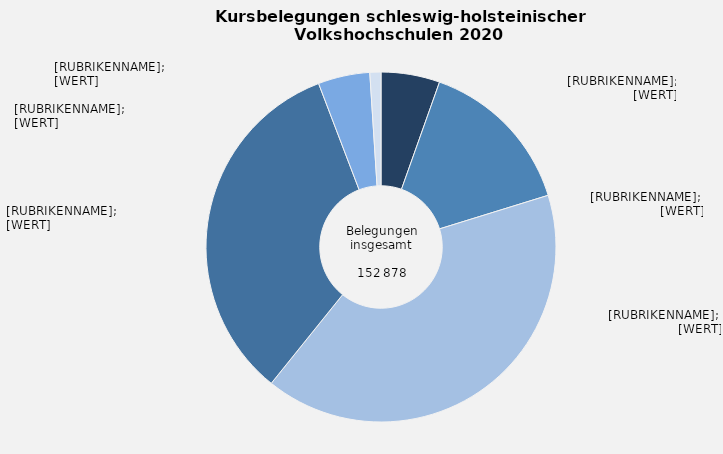
| Category | Kursbelegungen |
|---|---|
| Politik, Gesellschaft, Umwelt | 5.429 |
| Kultur, Gestalten | 14.797 |
| Gesundheit | 40.562 |
| Sprachen | 33.41 |
| Arbeit, Beruf | 4.78 |
| Grundbildung, Schulabschlüsse | 1.022 |